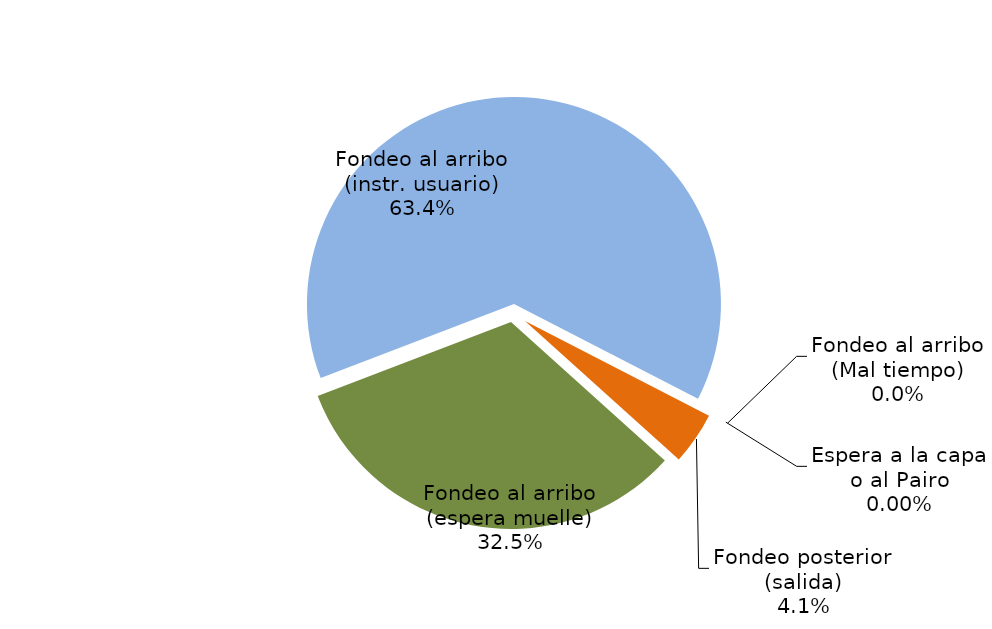
| Category | Series 0 |
|---|---|
| Fondeo al arribo (espera muelle) | 2422.781 |
| Fondeo al arribo (instr. usuario) | 4724.302 |
| Fondeo al arribo (Mal tiempo) | 0 |
| Espera a la capa o al Pairo | 0 |
| Fondeo posterior (salida) | 305.197 |